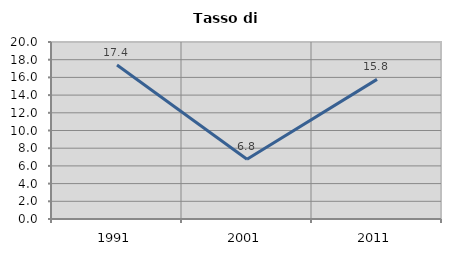
| Category | Tasso di disoccupazione   |
|---|---|
| 1991.0 | 17.395 |
| 2001.0 | 6.759 |
| 2011.0 | 15.776 |